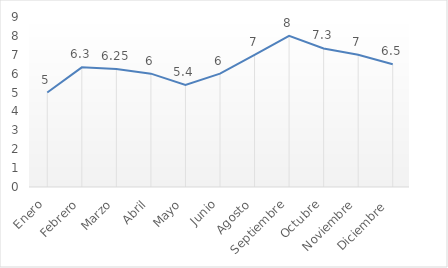
| Category | Promedio días por mes |
|---|---|
| Enero | 5 |
| Febrero | 6.333 |
| Marzo | 6.25 |
| Abril | 6 |
| Mayo | 5.4 |
| Junio | 6 |
| Agosto | 7 |
| Septiembre | 8 |
| Octubre | 7.333 |
| Noviembre | 7 |
| Diciembre  | 6.5 |